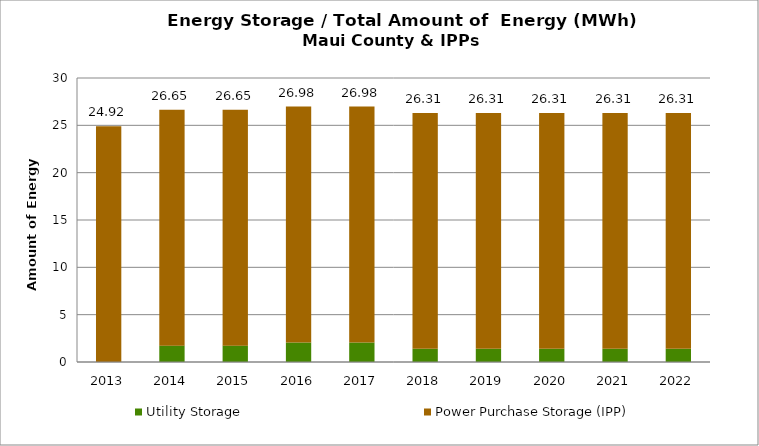
| Category | Utility Storage | Power Purchase Storage (IPP) |
|---|---|---|
| 2013.0 | 0 | 24.916 |
| 2014.0 | 1.729 | 24.916 |
| 2015.0 | 1.729 | 24.916 |
| 2016.0 | 2.062 | 24.916 |
| 2017.0 | 2.062 | 24.916 |
| 2018.0 | 1.397 | 24.916 |
| 2019.0 | 1.397 | 24.916 |
| 2020.0 | 1.397 | 24.916 |
| 2021.0 | 1.397 | 24.916 |
| 2022.0 | 1.397 | 24.916 |